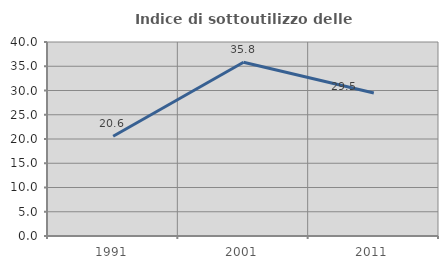
| Category | Indice di sottoutilizzo delle abitazioni  |
|---|---|
| 1991.0 | 20.556 |
| 2001.0 | 35.829 |
| 2011.0 | 29.469 |